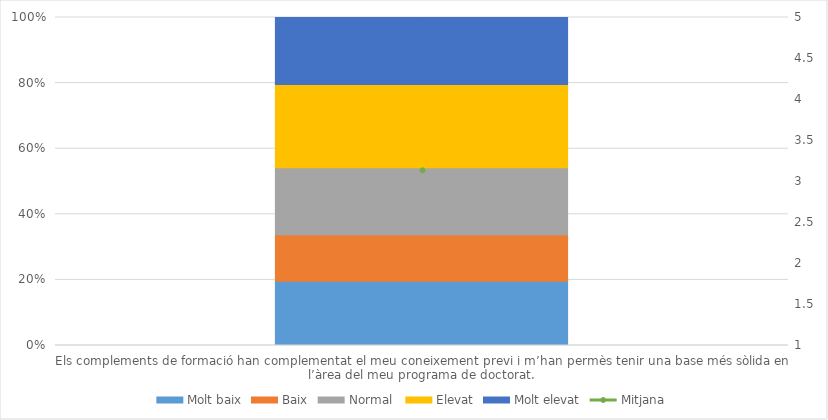
| Category | Molt baix | Baix | Normal  | Elevat | Molt elevat |
|---|---|---|---|---|---|
| Els complements de formació han complementat el meu coneixement previ i m’han permès tenir una base més sòlida en l’àrea del meu programa de doctorat. | 47 | 34 | 49 | 61 | 49 |